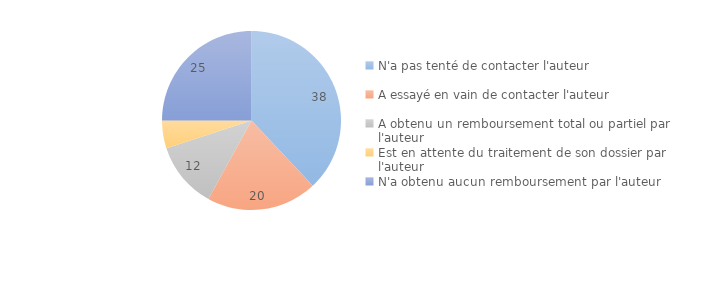
| Category | Series 0 |
|---|---|
| N'a pas tenté de contacter l'auteur | 38 |
| A essayé en vain de contacter l'auteur  | 20 |
| A obtenu un remboursement total ou partiel par l'auteur | 12 |
| Est en attente du traitement de son dossier par l'auteur | 5 |
| N'a obtenu aucun remboursement par l'auteur | 25 |